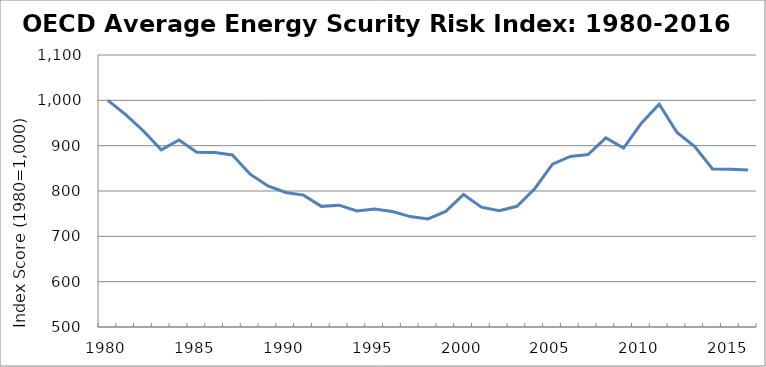
| Category | Total OECD Index |
|---|---|
| 1980.0 | 1000 |
| 1981.0 | 968.401 |
| 1982.0 | 932.415 |
| 1983.0 | 890.712 |
| 1984.0 | 912.7 |
| 1985.0 | 885.377 |
| 1986.0 | 884.743 |
| 1987.0 | 879.499 |
| 1988.0 | 837.067 |
| 1989.0 | 811.176 |
| 1990.0 | 796.66 |
| 1991.0 | 790.918 |
| 1992.0 | 766.1 |
| 1993.0 | 768.68 |
| 1994.0 | 755.863 |
| 1995.0 | 760.122 |
| 1996.0 | 754.789 |
| 1997.0 | 743.538 |
| 1998.0 | 738.229 |
| 1999.0 | 754.911 |
| 2000.0 | 792.415 |
| 2001.0 | 764.309 |
| 2002.0 | 756.543 |
| 2003.0 | 766.3 |
| 2004.0 | 805.05 |
| 2005.0 | 859.276 |
| 2006.0 | 876.182 |
| 2007.0 | 880.262 |
| 2008.0 | 916.984 |
| 2009.0 | 894.766 |
| 2010.0 | 949.474 |
| 2011.0 | 991.655 |
| 2012.0 | 929.048 |
| 2013.0 | 898.228 |
| 2014.0 | 848.754 |
| 2015.0 | 848.048 |
| 2016.0 | 846.28 |